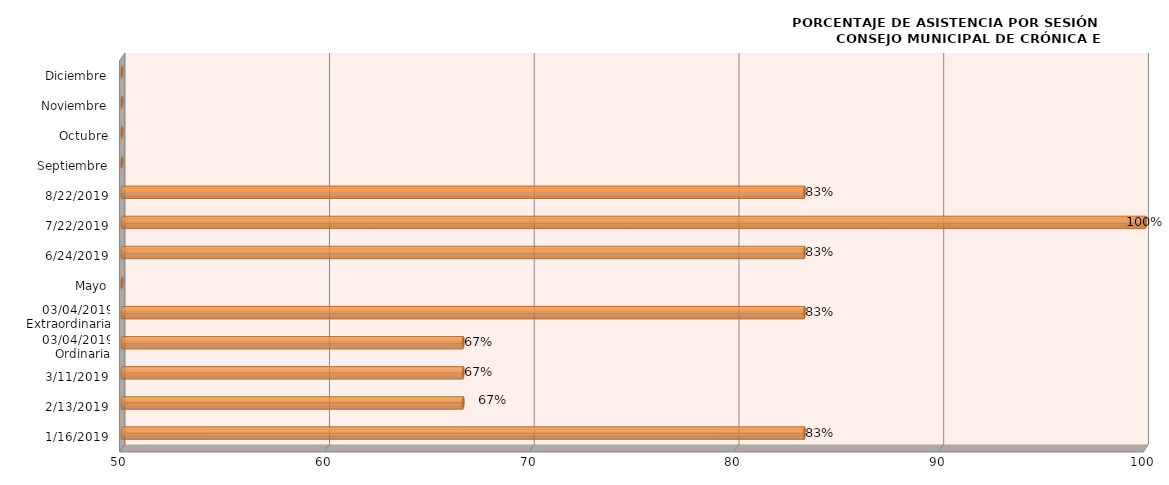
| Category | Series 0 |
|---|---|
| 16/01/2019 | 83.333 |
| 13/02/2019 | 66.667 |
| 11/03/2019 | 66.667 |
| 03/04/2019
Ordinaria | 66.667 |
| 03/04/2019
Extraordinaria | 83.333 |
| Mayo | 0 |
| 24/06/2019 | 83.333 |
| 22/07/2019 | 100 |
| 22/08/2019 | 83.333 |
| Septiembre | 0 |
| Octubre | 0 |
| Noviembre | 0 |
| Diciembre | 0 |